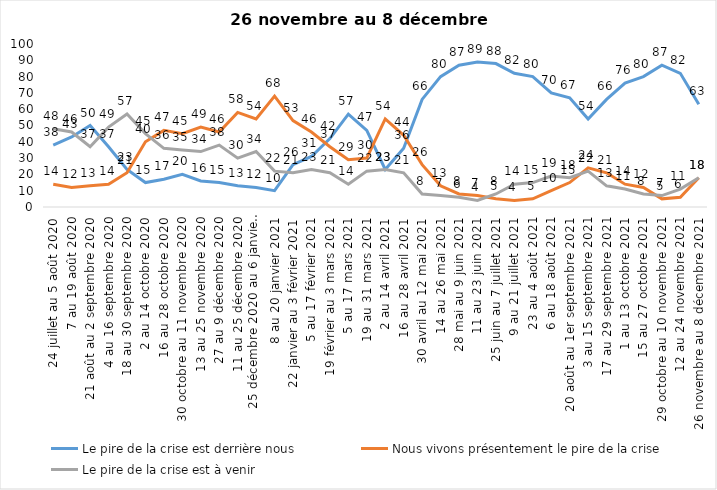
| Category | Le pire de la crise est derrière nous | Nous vivons présentement le pire de la crise | Le pire de la crise est à venir |
|---|---|---|---|
| 24 juillet au 5 août 2020 | 38 | 14 | 48 |
| 7 au 19 août 2020 | 43 | 12 | 46 |
| 21 août au 2 septembre 2020 | 50 | 13 | 37 |
| 4 au 16 septembre 2020 | 37 | 14 | 49 |
| 18 au 30 septembre 2020 | 23 | 21 | 57 |
| 2 au 14 octobre 2020 | 15 | 40 | 45 |
| 16 au 28 octobre 2020 | 17 | 47 | 36 |
| 30 octobre au 11 novembre 2020 | 20 | 45 | 35 |
| 13 au 25 novembre 2020 | 16 | 49 | 34 |
| 27 au 9 décembre 2020 | 15 | 46 | 38 |
| 11 au 25 décembre 2020 | 13 | 58 | 30 |
| 25 décembre 2020 au 6 janvier 2021 | 12 | 54 | 34 |
| 8 au 20 janvier 2021 | 10 | 68 | 22 |
| 22 janvier au 3 février 2021 | 26 | 53 | 21 |
| 5 au 17 février 2021 | 31 | 46 | 23 |
| 19 février au 3 mars 2021 | 42 | 37 | 21 |
| 5 au 17 mars 2021 | 57 | 29 | 14 |
| 19 au 31 mars 2021 | 47 | 30 | 22 |
| 2 au 14 avril 2021 | 23 | 54 | 23 |
| 16 au 28 avril 2021 | 36 | 44 | 21 |
| 30 avril au 12 mai 2021 | 66 | 26 | 8 |
| 14 au 26 mai 2021 | 80 | 13 | 7 |
| 28 mai au 9 juin 2021 | 87 | 8 | 6 |
| 11 au 23 juin 2021 | 89 | 7 | 4 |
| 25 juin au 7 juillet 2021 | 88 | 5 | 8 |
| 9 au 21 juillet 2021 | 82 | 4 | 14 |
| 23 au 4 août 2021 | 80 | 5 | 15 |
| 6 au 18 août 2021 | 70 | 10 | 19 |
| 20 août au 1er septembre 2021 | 67 | 15 | 18 |
| 3 au 15 septembre 2021 | 54 | 24 | 22 |
| 17 au 29 septembre 2021 | 66 | 21 | 13 |
| 1 au 13 octobre 2021 | 76 | 14 | 11 |
| 15 au 27 octobre 2021 | 80 | 12 | 8 |
| 29 octobre au 10 novembre 2021 | 87 | 5 | 7 |
| 12 au 24 novembre 2021 | 82 | 6 | 11 |
| 26 novembre au 8 décembre 2021 | 63 | 18 | 18 |